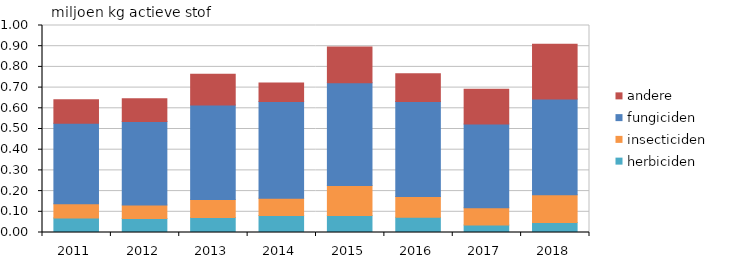
| Category | herbiciden | insecticiden | fungiciden | andere |
|---|---|---|---|---|
| 2011.0 | 70291.96 | 69090.821 | 387900.397 | 113891.866 |
| 2012.0 | 67952.681 | 65330.632 | 402452.029 | 110872.851 |
| 2013.0 | 72613.552 | 86672.535 | 456739.127 | 148612.476 |
| 2014.0 | 81921.009 | 84031.653 | 467159.33 | 89557.768 |
| 2015.0 | 82407.875 | 144536.46 | 496570.535 | 172373.264 |
| 2016.0 | 73807.083 | 99663.266 | 459133.306 | 134110.833 |
| 2017.0 | 36191.965 | 83698.377 | 403728.007 | 168207.533 |
| 2018.0 | 47917.039 | 134537.441 | 461917.963 | 265023.301 |